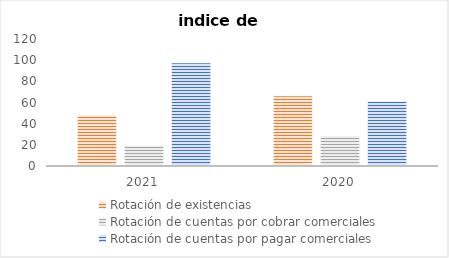
| Category | Rotación de existencias | Rotación de cuentas por cobrar comerciales | Rotación de cuentas por pagar comerciales |
|---|---|---|---|
| 2021 | 48 | 19 | 97 |
| 2020 | 66 | 28 | 61 |